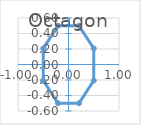
| Category | Octagon |
|---|---|
| -0.5 | -0.207 |
| -0.5 | 0.207 |
| -0.20710678118654757 | 0.5 |
| 0.20710678118654757 | 0.5 |
| 0.5 | 0.207 |
| 0.5 | -0.207 |
| 0.20710678118654757 | -0.5 |
| -0.20710678118654757 | -0.5 |
| -0.5 | -0.207 |